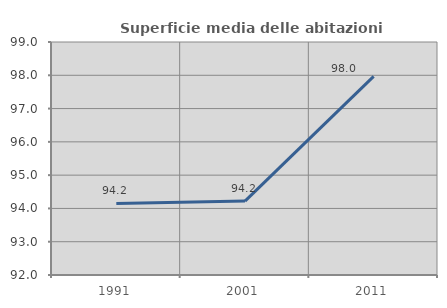
| Category | Superficie media delle abitazioni occupate |
|---|---|
| 1991.0 | 94.151 |
| 2001.0 | 94.221 |
| 2011.0 | 97.966 |